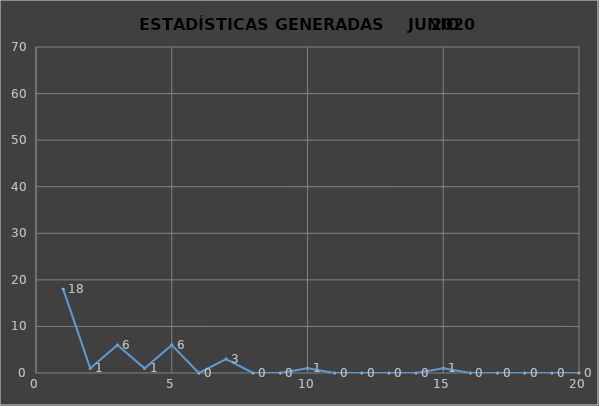
| Category |                   ESTADÍSTICAS GENERADAS     PERÍODO JUNIO 2020 CANTIDAD |
|---|---|
| 0 | 18 |
| 1 | 1 |
| 2 | 6 |
| 3 | 1 |
| 4 | 6 |
| 5 | 0 |
| 6 | 3 |
| 7 | 0 |
| 8 | 0 |
| 9 | 1 |
| 10 | 0 |
| 11 | 0 |
| 12 | 0 |
| 13 | 0 |
| 14 | 1 |
| 15 | 0 |
| 16 | 0 |
| 17 | 0 |
| 18 | 0 |
| 19 | 0 |